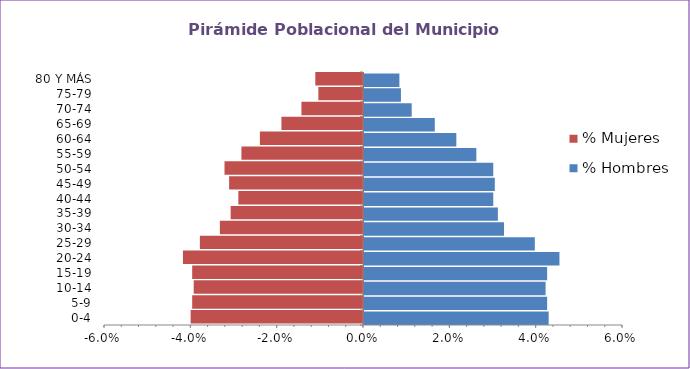
| Category | % Hombres | % Mujeres |
|---|---|---|
| 0-4 | 0.043 | -0.04 |
| 5-9 | 0.042 | -0.04 |
| 10-14 | 0.042 | -0.039 |
| 15-19 | 0.042 | -0.04 |
| 20-24 | 0.045 | -0.042 |
| 25-29 | 0.04 | -0.038 |
| 30-34 | 0.032 | -0.033 |
| 35-39 | 0.031 | -0.031 |
| 40-44 | 0.03 | -0.029 |
| 45-49 | 0.03 | -0.031 |
| 50-54 | 0.03 | -0.032 |
| 55-59 | 0.026 | -0.028 |
| 60-64 | 0.021 | -0.024 |
| 65-69 | 0.016 | -0.019 |
| 70-74 | 0.011 | -0.014 |
| 75-79 | 0.009 | -0.01 |
| 80 Y MÁS | 0.008 | -0.011 |